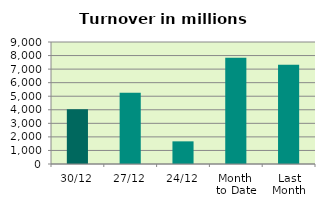
| Category | Series 0 |
|---|---|
| 30/12 | 4041.37 |
| 27/12 | 5261.7 |
| 24/12 | 1670.955 |
| Month 
to Date | 7830.524 |
| Last
Month | 7326.344 |